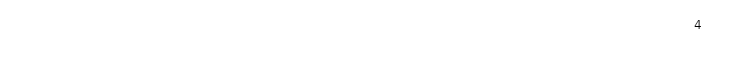
| Category | Итоговая оценка |
|---|---|
| Вопрос 4 | 4 |